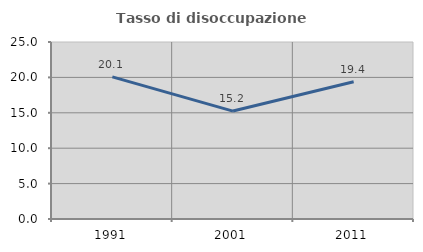
| Category | Tasso di disoccupazione giovanile  |
|---|---|
| 1991.0 | 20.069 |
| 2001.0 | 15.244 |
| 2011.0 | 19.388 |